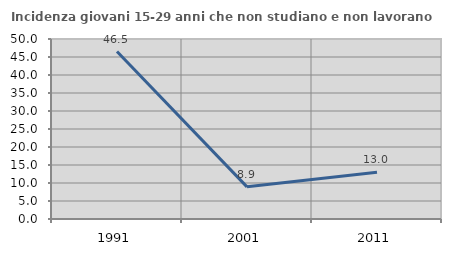
| Category | Incidenza giovani 15-29 anni che non studiano e non lavorano  |
|---|---|
| 1991.0 | 46.508 |
| 2001.0 | 8.929 |
| 2011.0 | 12.982 |